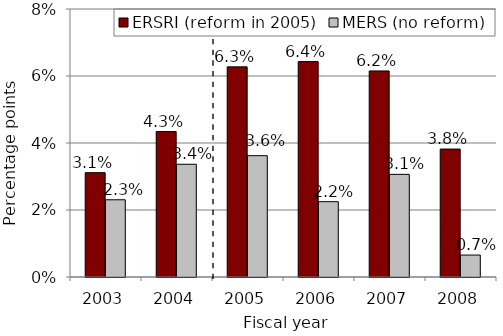
| Category | ERSRI (reform in 2005) | MERS (no reform) |
|---|---|---|
| 2003.0 | 3.114 | 2.305 |
| 2004.0 | 4.343 | 3.365 |
| 2005.0 | 6.272 | 3.622 |
| 2006.0 | 6.431 | 2.249 |
| 2007.0 | 6.151 | 3.064 |
| 2008.0 | 3.819 | 0.655 |